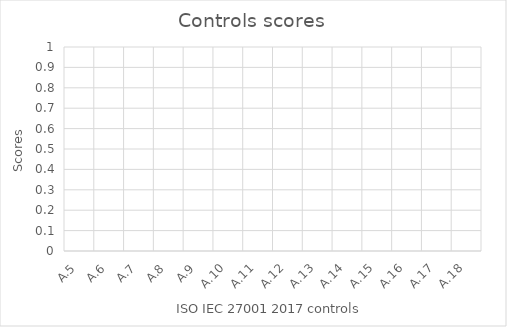
| Category | Scores |
|---|---|
| A.5 | 0 |
| A.6 | 0 |
| A.7 | 0 |
| A.8 | 0 |
| A.9 | 0 |
| A.10 | 0 |
| A.11 | 0 |
| A.12 | 0 |
| A.13 | 0 |
| A.14 | 0 |
| A.15 | 0 |
| A.16 | 0 |
| A.17 | 0 |
| A.18 | 0 |